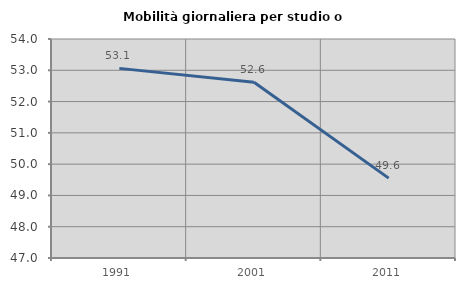
| Category | Mobilità giornaliera per studio o lavoro |
|---|---|
| 1991.0 | 53.061 |
| 2001.0 | 52.619 |
| 2011.0 | 49.552 |